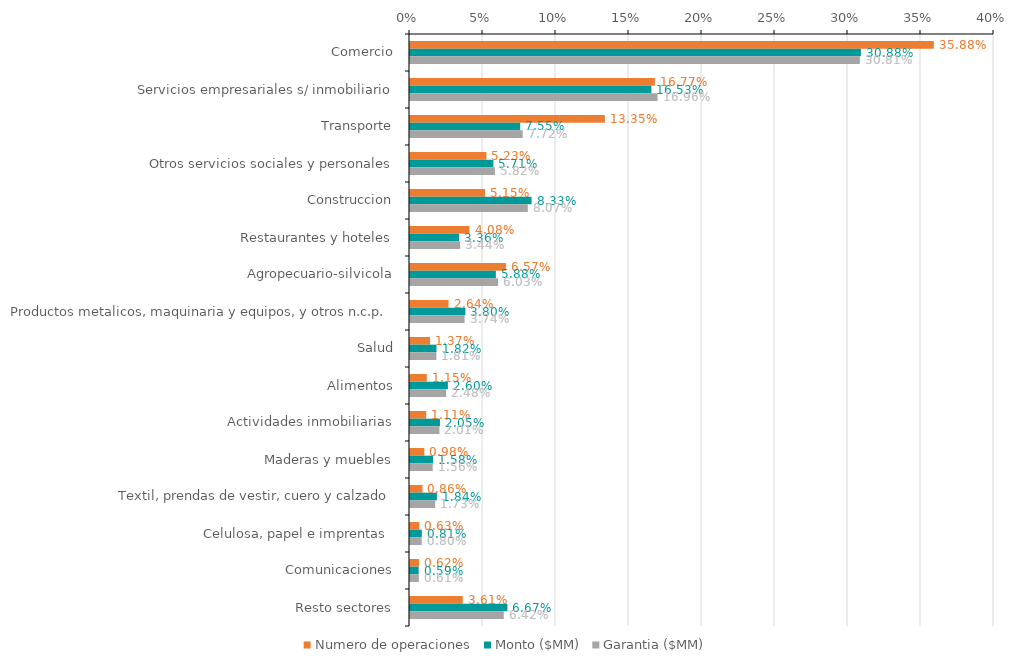
| Category | Numero de operaciones | Monto ($MM) | Garantia ($MM) |
|---|---|---|---|
| Comercio | 0.359 | 0.309 | 0.308 |
| Servicios empresariales s/ inmobiliario | 0.168 | 0.165 | 0.17 |
| Transporte | 0.133 | 0.076 | 0.077 |
| Otros servicios sociales y personales | 0.052 | 0.057 | 0.058 |
| Construccion | 0.052 | 0.083 | 0.081 |
| Restaurantes y hoteles | 0.041 | 0.034 | 0.034 |
| Agropecuario-silvicola | 0.066 | 0.059 | 0.06 |
| Productos metalicos, maquinaria y equipos, y otros n.c.p. | 0.026 | 0.038 | 0.037 |
| Salud | 0.014 | 0.018 | 0.018 |
| Alimentos | 0.012 | 0.026 | 0.025 |
| Actividades inmobiliarias | 0.011 | 0.021 | 0.02 |
| Maderas y muebles | 0.01 | 0.016 | 0.016 |
| Textil, prendas de vestir, cuero y calzado | 0.009 | 0.018 | 0.017 |
| Celulosa, papel e imprentas  | 0.006 | 0.008 | 0.008 |
| Comunicaciones | 0.006 | 0.006 | 0.006 |
| Resto sectores | 0.036 | 0.067 | 0.064 |